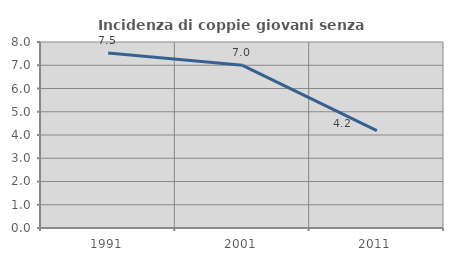
| Category | Incidenza di coppie giovani senza figli |
|---|---|
| 1991.0 | 7.524 |
| 2001.0 | 6.996 |
| 2011.0 | 4.186 |